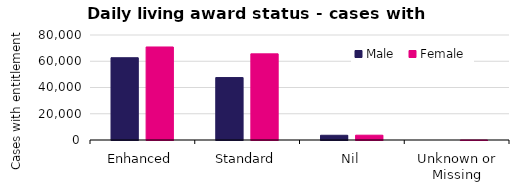
| Category | Male  | Female |
|---|---|---|
| Enhanced | 62681 | 70875 |
| Standard | 47580 | 65623 |
| Nil | 3602 | 3660 |
| Unknown or Missing | 0 | 11 |